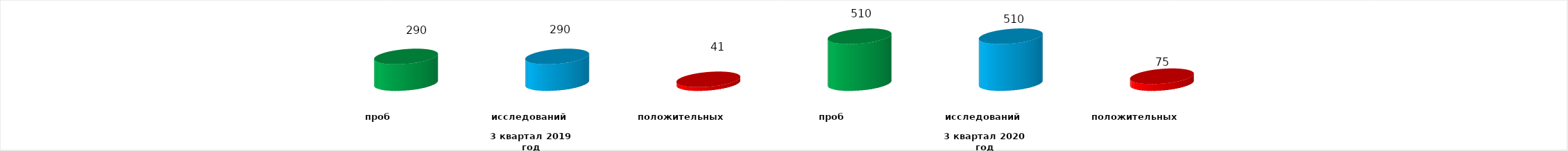
| Category | Series 4 |
|---|---|
| 0 | 290 |
| 1 | 290 |
| 2 | 41 |
| 3 | 510 |
| 4 | 510 |
| 5 | 75 |